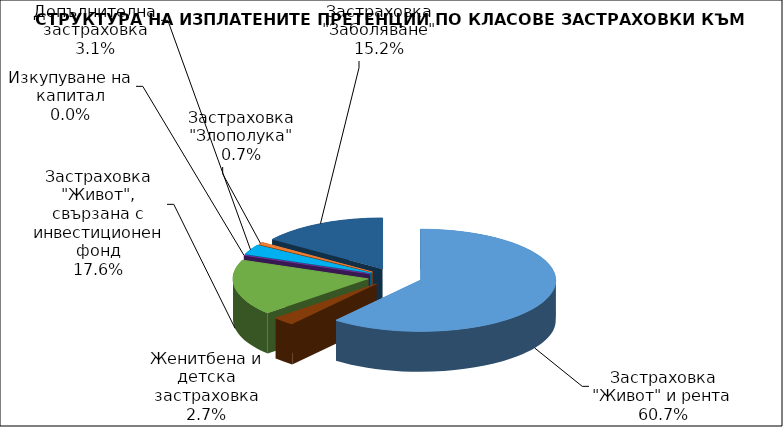
| Category | Застраховка "Живот" и рента |
|---|---|
| Застраховка "Живот" и рента | 78739141.329 |
| Женитбена и детска застраховка | 3448057.774 |
| Застраховка "Живот", свързана с инвестиционен фонд | 22881077.952 |
| Изкупуване на капитал | 0 |
| Допълнителна застраховка | 4080808.685 |
| Застраховка "Злополука" | 932896.916 |
| Застраховка "Заболяване" | 19670524.435 |